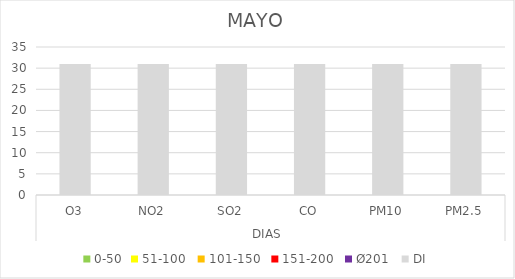
| Category | 0-50 | 51-100  | 101-150  | 151-200  | Ø201  | DI |
|---|---|---|---|---|---|---|
| 0 | 0 | 0 | 0 | 0 | 0 | 31 |
| 1 | 0 | 0 | 0 | 0 | 0 | 31 |
| 2 | 0 | 0 | 0 | 0 | 0 | 31 |
| 3 | 0 | 0 | 0 | 0 | 0 | 31 |
| 4 | 0 | 0 | 0 | 0 | 0 | 31 |
| 5 | 0 | 0 | 0 | 0 | 0 | 31 |